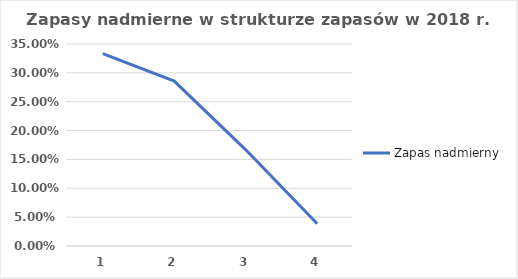
| Category | Zapas nadmierny |
|---|---|
| 0 | 0.333 |
| 1 | 0.286 |
| 2 | 0.167 |
| 3 | 0.038 |